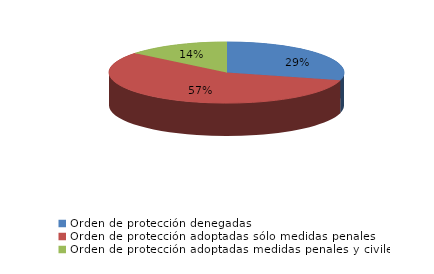
| Category | Series 0 |
|---|---|
| Orden de protección denegadas | 109 |
| Orden de protección adoptadas sólo medidas penales | 213 |
| Orden de protección adoptadas medidas penales y civiles | 53 |